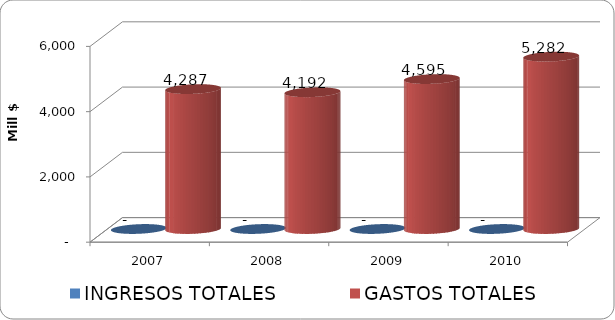
| Category | INGRESOS TOTALES | GASTOS TOTALES |
|---|---|---|
| 2007 | 0 | 4287.389 |
| 2008 | 0 | 4191.507 |
| 2009 | 0 | 4595.293 |
| 2010 | 0 | 5282.228 |